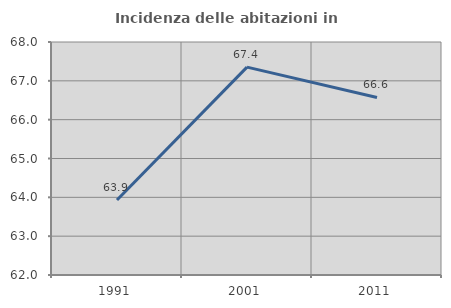
| Category | Incidenza delle abitazioni in proprietà  |
|---|---|
| 1991.0 | 63.932 |
| 2001.0 | 67.354 |
| 2011.0 | 66.572 |